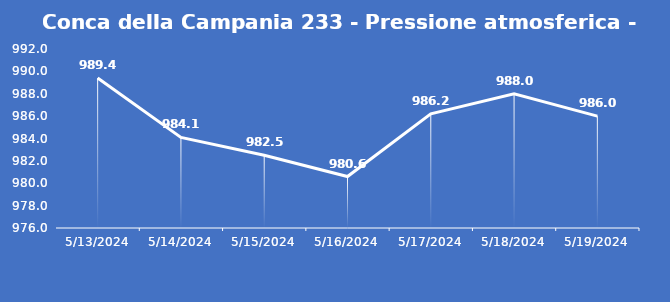
| Category | Conca della Campania 233 - Pressione atmosferica - Grezzo (hPa) |
|---|---|
| 5/13/24 | 989.4 |
| 5/14/24 | 984.1 |
| 5/15/24 | 982.5 |
| 5/16/24 | 980.6 |
| 5/17/24 | 986.2 |
| 5/18/24 | 988 |
| 5/19/24 | 986 |